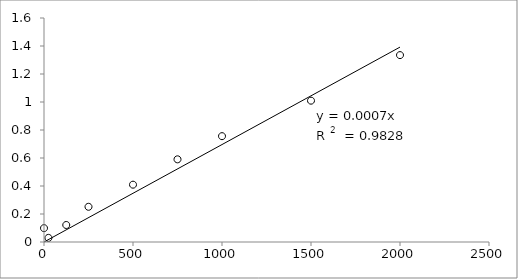
| Category | Series 0 |
|---|---|
| 2000.0 | 1.335 |
| 1500.0 | 1.01 |
| 1000.0 | 0.756 |
| 750.0 | 0.59 |
| 500.0 | 0.41 |
| 250.0 | 0.252 |
| 125.0 | 0.122 |
| 25.0 | 0.03 |
| 0.0 | 0.099 |